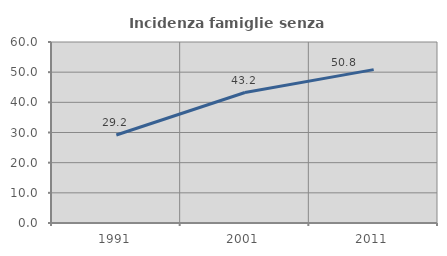
| Category | Incidenza famiglie senza nuclei |
|---|---|
| 1991.0 | 29.171 |
| 2001.0 | 43.248 |
| 2011.0 | 50.841 |